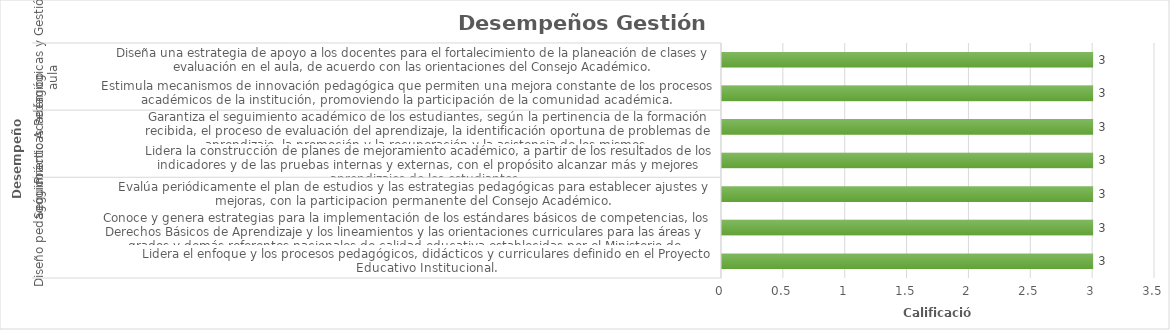
| Category | Series 0 |
|---|---|
| 0 | 3 |
| 1 | 3 |
| 2 | 3 |
| 3 | 3 |
| 4 | 3 |
| 5 | 3 |
| 6 | 3 |